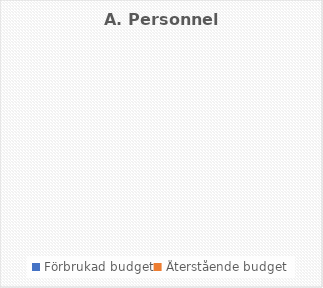
| Category | A. Personnel costs |
|---|---|
| Förbrukad budget | 0 |
| Återstående budget | 0 |